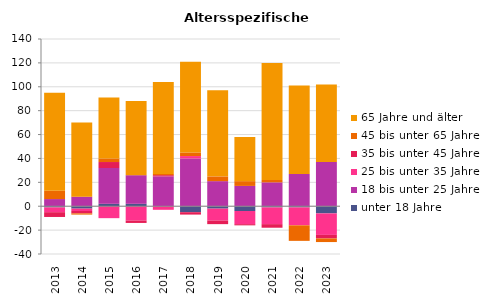
| Category | unter 18 Jahre | 18 bis unter 25 Jahre | 25 bis unter 35 Jahre | 35 bis unter 45 Jahre | 45 bis unter 65 Jahre | 65 Jahre und älter |
|---|---|---|---|---|---|---|
| 2013.0 | -1 | 6 | -4 | -4 | 7 | 82 |
| 2014.0 | -2 | 8 | -2 | -2 | -1 | 62 |
| 2015.0 | 2 | 30 | -10 | 5 | 3 | 51 |
| 2016.0 | 2 | 24 | -12 | -2 | 0 | 62 |
| 2017.0 | 0 | 25 | -3 | 1 | 1 | 77 |
| 2018.0 | -5 | 40 | 2 | -2 | 3 | 76 |
| 2019.0 | -2 | 21 | -10 | -3 | 4 | 72 |
| 2020.0 | -4 | 17 | -11 | -1 | 4 | 37 |
| 2021.0 | -1 | 20 | -14 | -3 | 2 | 98 |
| 2022.0 | -1 | 27 | -15 | 0 | -13 | 74 |
| 2023.0 | -6 | 37 | -18 | -3 | -3 | 65 |